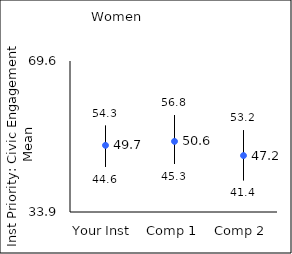
| Category | 25th percentile | 75th percentile | Mean |
|---|---|---|---|
| Your Inst | 44.6 | 54.3 | 49.66 |
| Comp 1 | 45.3 | 56.8 | 50.6 |
| Comp 2 | 41.4 | 53.2 | 47.24 |